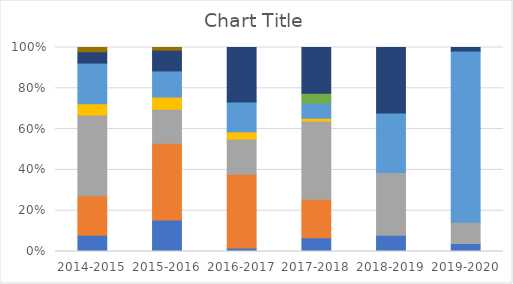
| Category | Business Service | Clearance | Food | Office Supplies | Products | Service Credit | Transfer Out | Transportation | Travel | Unknown |
|---|---|---|---|---|---|---|---|---|---|---|
| 2014-2015 | 2924.1 | 7124.47 | 14549.97 | 2057.96 | 7314.39 | 0 | 2056 | 0 | 22.15 | 735.51 |
| 2015-2016 | 7838.5 | 19055.35 | 8427.79 | 3008.84 | 6497.85 | 0 | 5193.6 | 30.7 | 0 | 593 |
| 2016-2017 | 1122.86 | 23343.69 | 11123.56 | 2274.84 | 9463.51 | 0 | 17233.82 | 0 | 0 | 0 |
| 2017-2018 | 5150.1 | 14436.39 | 29252.23 | 1085.09 | 5664.26 | 3735.53 | 17121.12 | 0 | 0 | 0 |
| 2018-2019 | 6845.29 | 0 | 26545.82 | 0 | 25200.57 | 0 | 27697.39 | 0 | 0 | 0 |
| 2019-2020 | 555.12 | 0 | 1467.51 | 0 | 11826 | 0 | 244.48 | 0 | 0 | 0 |